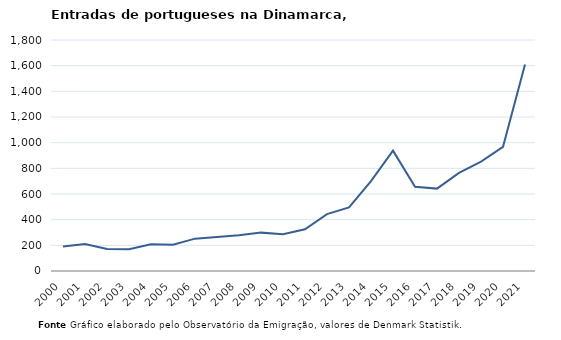
| Category | Entradas |
|---|---|
| 2000.0 | 190 |
| 2001.0 | 211 |
| 2002.0 | 171 |
| 2003.0 | 170 |
| 2004.0 | 208 |
| 2005.0 | 205 |
| 2006.0 | 252 |
| 2007.0 | 265 |
| 2008.0 | 279 |
| 2009.0 | 299 |
| 2010.0 | 287 |
| 2011.0 | 325 |
| 2012.0 | 443 |
| 2013.0 | 496 |
| 2014.0 | 701 |
| 2015.0 | 938 |
| 2016.0 | 656 |
| 2017.0 | 642 |
| 2018.0 | 765 |
| 2019.0 | 852 |
| 2020.0 | 968 |
| 2021.0 | 1609 |